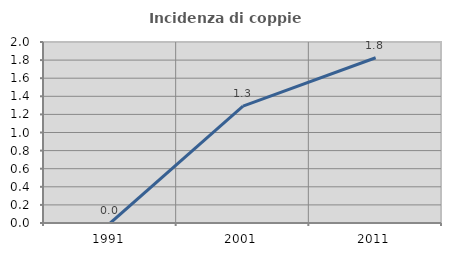
| Category | Incidenza di coppie miste |
|---|---|
| 1991.0 | 0 |
| 2001.0 | 1.291 |
| 2011.0 | 1.826 |